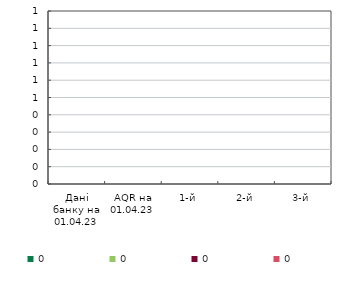
| Category | 0 |
|---|---|
| Дані банку на 01.04.23 | 0 |
| AQR на 01.04.23 | 0 |
| 1-й | 0 |
| 2-й | 0 |
| 3-й | 0 |